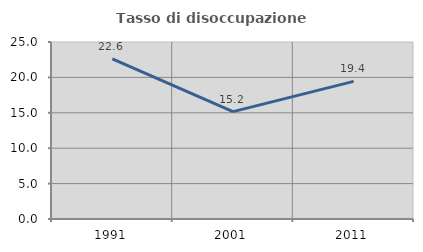
| Category | Tasso di disoccupazione giovanile  |
|---|---|
| 1991.0 | 22.622 |
| 2001.0 | 15.17 |
| 2011.0 | 19.444 |